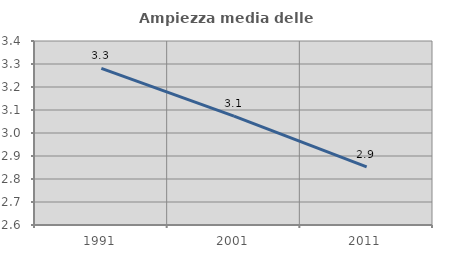
| Category | Ampiezza media delle famiglie |
|---|---|
| 1991.0 | 3.281 |
| 2001.0 | 3.073 |
| 2011.0 | 2.853 |